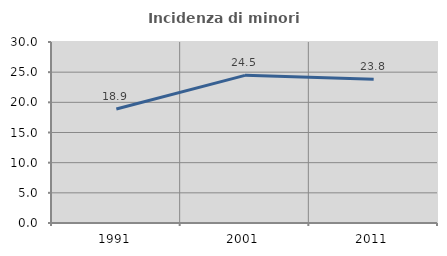
| Category | Incidenza di minori stranieri |
|---|---|
| 1991.0 | 18.902 |
| 2001.0 | 24.471 |
| 2011.0 | 23.842 |